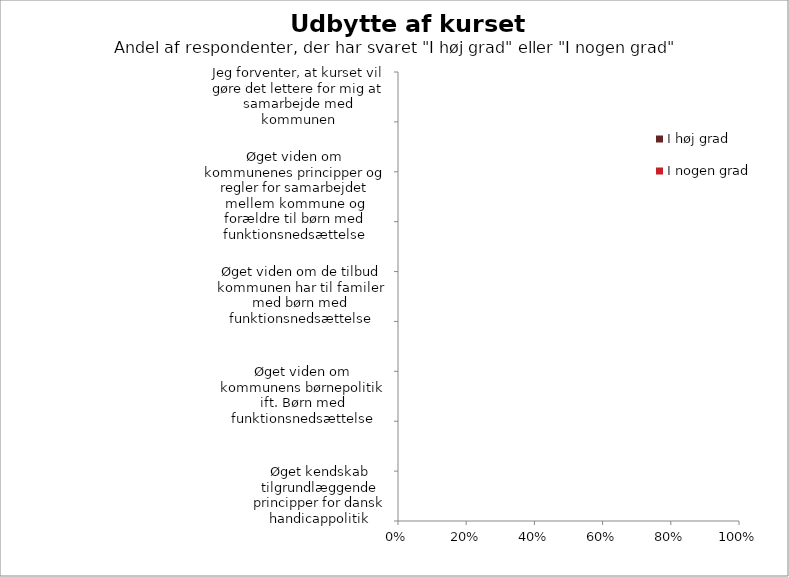
| Category | I høj grad | I nogen grad |
|---|---|---|
| Øget kendskab tilgrundlæggende principper for dansk handicappolitik | 0 | 0 |
| Øget kendskab til støttemuligheder, der kunne være relevante for mit barn | 0 | 0 |
| Øget viden om kommunens børnepolitik ift. Børn med funktionsnedsættelse | 0 | 0 |
| Øget viden om hvordan kommunen er organiseret ift. Børn me funktionsnedsættelse | 0 | 0 |
| Øget viden om de tilbud kommunen har til familer med børn med funktionsnedsættelse | 0 | 0 |
| Øget viden om, hvor jeg skal henvende mig i kommenen med spørgsmål eller problemstillinger i relation til mit barns funktionsnedsættelse | 0 | 0 |
| Øget viden om kommunenes principper og regler for samarbejdet mellem kommune og forældre til børn med funktionsnedsættelse | 0 | 0 |
| Jeg er blevet klædt på til at kunne forstå information om kommunens tilbud og støttemuligheder | 0 | 0 |
| Jeg forventer, at kurset vil gøre det lettere for mig at samarbejde med kommunen | 0 | 0 |